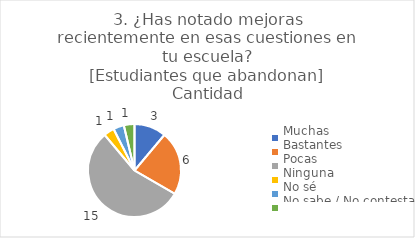
| Category | 3. ¿Has notado mejoras recientemente en esas cuestiones en tu escuela?
[Estudiantes que abandonan] |
|---|---|
| Muchas  | 0.111 |
| Bastantes  | 0.222 |
| Pocas  | 0.556 |
| Ninguna  | 0.037 |
| No sé  | 0.037 |
| No sabe / No contesta | 0.037 |